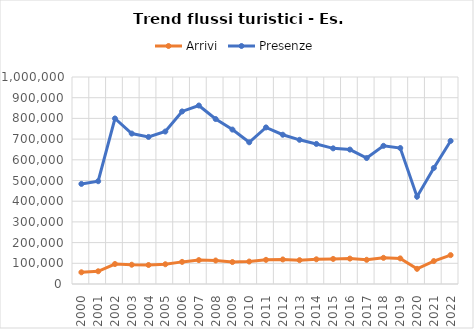
| Category | Arrivi | Presenze |
|---|---|---|
| 2000.0 | 56551 | 483569 |
| 2001.0 | 61491 | 496593 |
| 2002.0 | 96547 | 799574 |
| 2003.0 | 93105 | 726771 |
| 2004.0 | 91758 | 710417 |
| 2005.0 | 95438 | 736516 |
| 2006.0 | 106814 | 833609 |
| 2007.0 | 115449 | 862251 |
| 2008.0 | 113514 | 797006 |
| 2009.0 | 106040 | 745998 |
| 2010.0 | 108482 | 684626 |
| 2011.0 | 116682 | 756406 |
| 2012.0 | 118582 | 721126 |
| 2013.0 | 115196 | 696548 |
| 2014.0 | 119257 | 676691 |
| 2015.0 | 121115 | 655331 |
| 2016.0 | 122711 | 649353 |
| 2017.0 | 116853 | 608567 |
| 2018.0 | 126362 | 667435 |
| 2019.0 | 123657 | 656873 |
| 2020.0 | 73201 | 421880 |
| 2021.0 | 110769 | 560605 |
| 2022.0 | 139470 | 691214 |